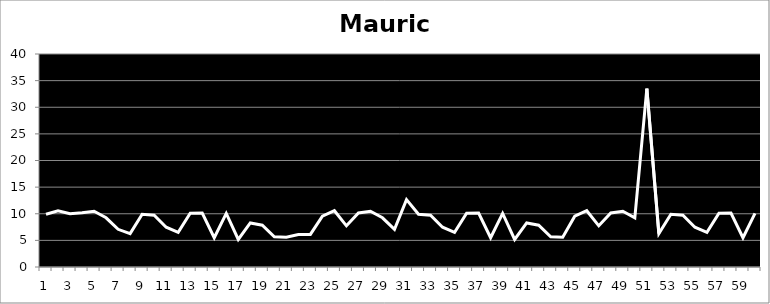
| Category | Maurice |
|---|---|
| 0 | 9.903 |
| 1 | 10.555 |
| 2 | 10.001 |
| 3 | 10.201 |
| 4 | 10.479 |
| 5 | 9.241 |
| 6 | 7.08 |
| 7 | 6.278 |
| 8 | 9.905 |
| 9 | 9.719 |
| 10 | 7.466 |
| 11 | 6.505 |
| 12 | 10.093 |
| 13 | 10.122 |
| 14 | 5.49 |
| 15 | 10.057 |
| 16 | 5.175 |
| 17 | 8.278 |
| 18 | 7.849 |
| 19 | 5.677 |
| 20 | 5.575 |
| 21 | 6.111 |
| 22 | 6.123 |
| 23 | 9.529 |
| 24 | 10.572 |
| 25 | 7.733 |
| 26 | 10.147 |
| 27 | 10.479 |
| 28 | 9.241 |
| 29 | 7.08 |
| 30 | 12.66 |
| 31 | 9.905 |
| 32 | 9.719 |
| 33 | 7.466 |
| 34 | 6.505 |
| 35 | 10.093 |
| 36 | 10.122 |
| 37 | 5.49 |
| 38 | 10.057 |
| 39 | 5.175 |
| 40 | 8.278 |
| 41 | 7.849 |
| 42 | 5.677 |
| 43 | 5.575 |
| 44 | 9.529 |
| 45 | 10.572 |
| 46 | 7.733 |
| 47 | 10.147 |
| 48 | 10.479 |
| 49 | 9.241 |
| 50 | 33.518 |
| 51 | 6.278 |
| 52 | 9.905 |
| 53 | 9.719 |
| 54 | 7.466 |
| 55 | 6.505 |
| 56 | 10.093 |
| 57 | 10.122 |
| 58 | 5.49 |
| 59 | 10.057 |